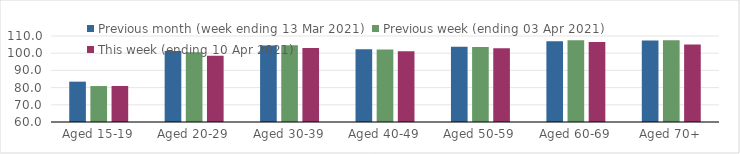
| Category | Previous month (week ending 13 Mar 2021) | Previous week (ending 03 Apr 2021) | This week (ending 10 Apr 2021) |
|---|---|---|---|
| Aged 15-19 | 83.45 | 80.9 | 80.95 |
| Aged 20-29 | 101.32 | 100.59 | 98.58 |
| Aged 30-39 | 104.52 | 104.56 | 103.07 |
| Aged 40-49 | 102.29 | 102.22 | 101.18 |
| Aged 50-59 | 103.79 | 103.6 | 102.89 |
| Aged 60-69 | 106.96 | 107.55 | 106.5 |
| Aged 70+ | 107.44 | 107.6 | 105.04 |